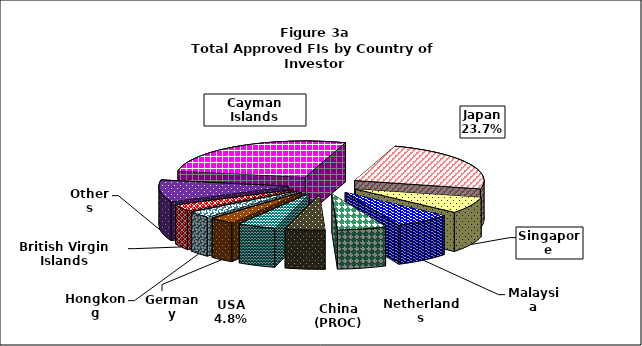
| Category | Series 0 |
|---|---|
| Cayman Islands | 4833.6 |
| Japan | 4205.224 |
| Singapore | 1309.664 |
| Malaysia | 1250.956 |
| Netherlands | 1088.281 |
| China (PROC) | 880.399 |
| USA | 849.19 |
| Germany | 546.717 |
| Hongkong | 530.441 |
| British Virgin Islands | 512.894 |
| Others | 1726.584 |